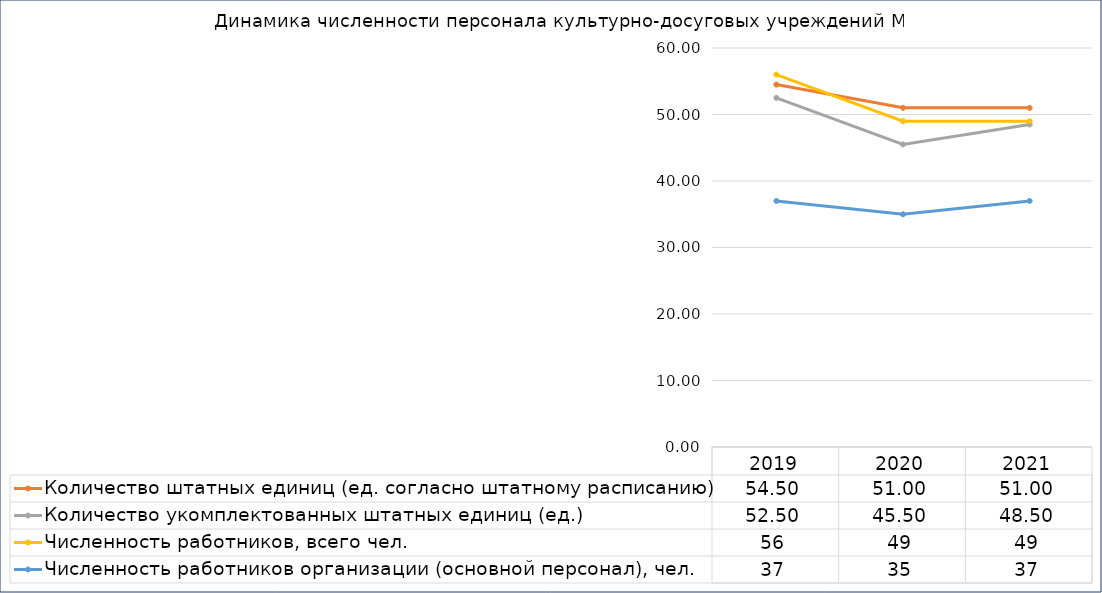
| Category | Количество штатных единиц (ед. согласно штатному расписанию) | Количество укомплектованных штатных единиц (ед.) | Численность работников, всего чел. | Численность работников организации (основной персонал), чел. |
|---|---|---|---|---|
| 2019.0 | 54.5 | 52.5 | 56 | 37 |
| 2020.0 | 51 | 45.5 | 49 | 35 |
| 2021.0 | 51 | 48.5 | 49 | 37 |